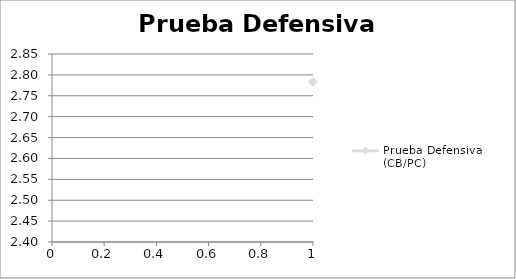
| Category | Prueba Defensiva (CB/PC) |
|---|---|
| 0 | 2.783 |
| 1 | 2.54 |
| 2 | 2.71 |
| 3 | 2.605 |
| 4 | 2.637 |
| 5 | 2.655 |
| 6 | 2.533 |
| 7 | 2.42 |